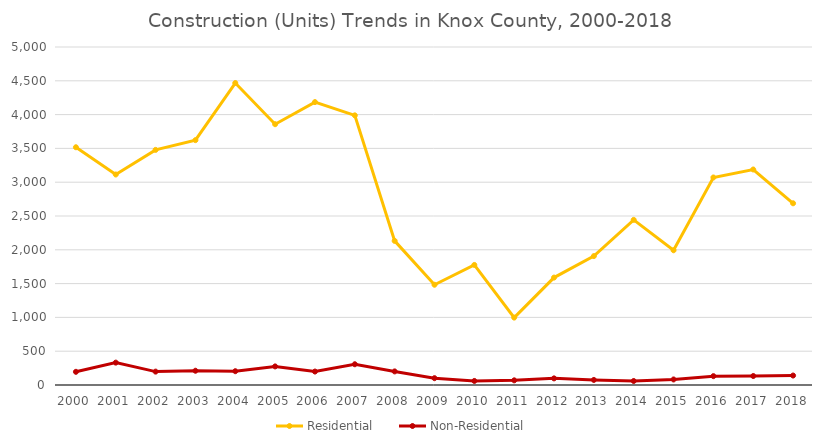
| Category | Residential | Non-Residential |
|---|---|---|
| 2000.0 | 3517 | 195 |
| 2001.0 | 3114 | 331 |
| 2002.0 | 3478 | 198 |
| 2003.0 | 3622 | 211 |
| 2004.0 | 4467 | 204 |
| 2005.0 | 3858 | 275 |
| 2006.0 | 4185 | 199 |
| 2007.0 | 3989 | 307 |
| 2008.0 | 2132 | 201 |
| 2009.0 | 1483 | 101 |
| 2010.0 | 1776 | 60 |
| 2011.0 | 997 | 69 |
| 2012.0 | 1589 | 98 |
| 2013.0 | 1907 | 75 |
| 2014.0 | 2443 | 59 |
| 2015.0 | 1993 | 82 |
| 2016.0 | 3070 | 131 |
| 2017.0 | 3188 | 133 |
| 2018.0 | 2688 | 140 |